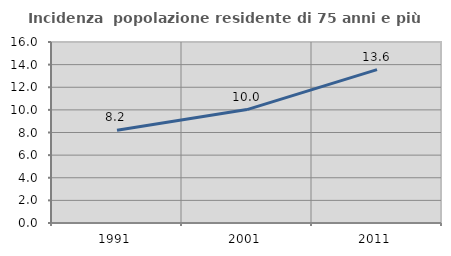
| Category | Incidenza  popolazione residente di 75 anni e più |
|---|---|
| 1991.0 | 8.205 |
| 2001.0 | 10.027 |
| 2011.0 | 13.555 |